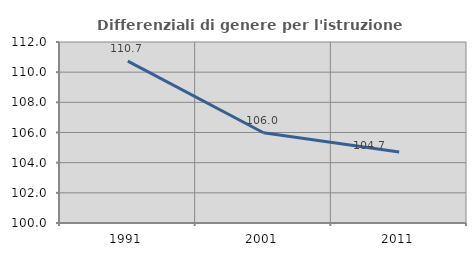
| Category | Differenziali di genere per l'istruzione superiore |
|---|---|
| 1991.0 | 110.73 |
| 2001.0 | 105.983 |
| 2011.0 | 104.705 |